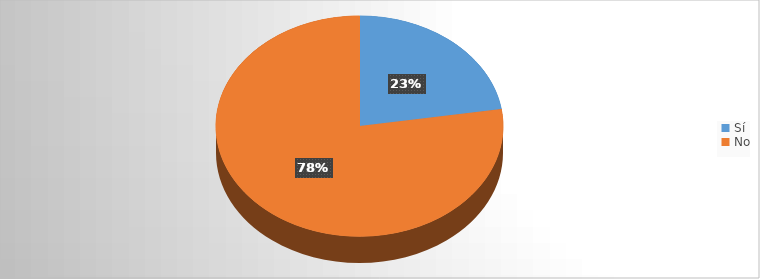
| Category | Series 0 |
|---|---|
| Sí | 9 |
| No | 31 |